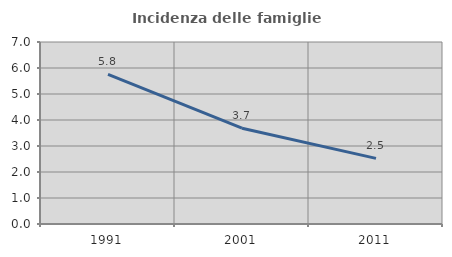
| Category | Incidenza delle famiglie numerose |
|---|---|
| 1991.0 | 5.758 |
| 2001.0 | 3.686 |
| 2011.0 | 2.525 |